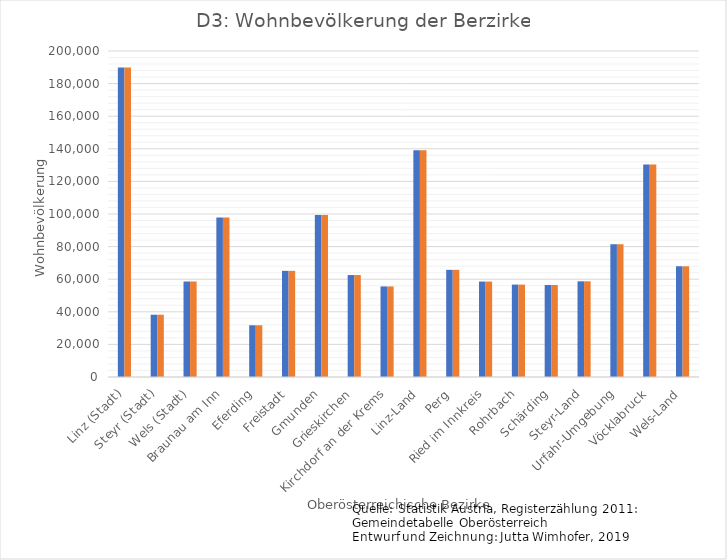
| Category | Series 0 | Series 1 |
|---|---|---|
| Linz (Stadt) | 189889 | 189889 |
| Steyr (Stadt) | 38205 | 38205 |
| Wels (Stadt) | 58591 | 58591 |
| Braunau am Inn | 97826 | 97826 |
| Eferding | 31741 | 31741 |
| Freistadt | 65113 | 65113 |
| Gmunden | 99403 | 99403 |
| Grieskirchen | 62555 | 62555 |
| Kirchdorf an der Krems | 55557 | 55557 |
| Linz-Land | 139116 | 139116 |
| Perg | 65738 | 65738 |
| Ried im Innkreis | 58553 | 58553 |
| Rohrbach | 56688 | 56688 |
| Schärding | 56426 | 56426 |
| Steyr-Land | 58700 | 58700 |
| Urfahr-Umgebung | 81400 | 81400 |
| Vöcklabruck | 130316 | 130316 |
| Wels-Land | 67945 | 67945 |